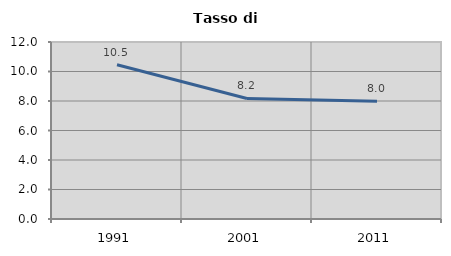
| Category | Tasso di disoccupazione   |
|---|---|
| 1991.0 | 10.463 |
| 2001.0 | 8.17 |
| 2011.0 | 7.988 |